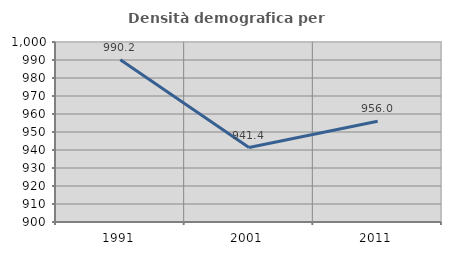
| Category | Densità demografica |
|---|---|
| 1991.0 | 990.15 |
| 2001.0 | 941.366 |
| 2011.0 | 956.02 |